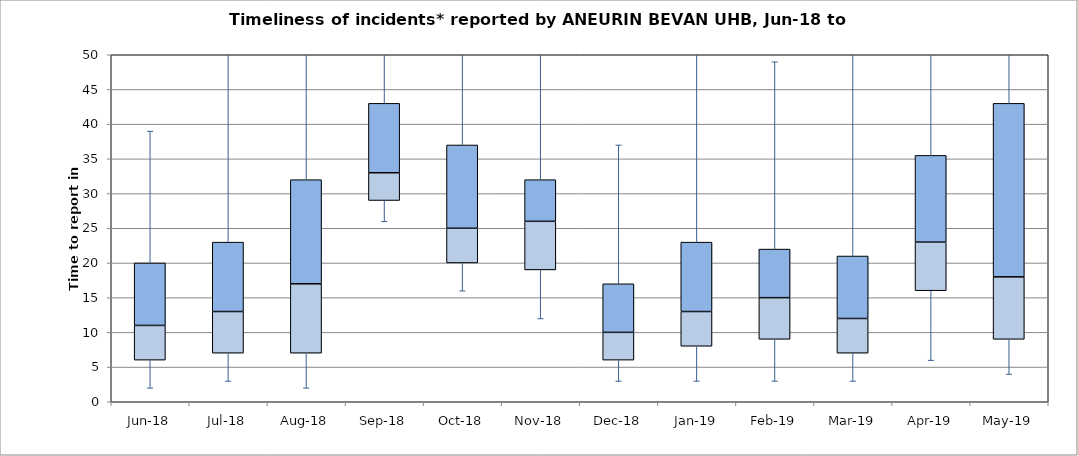
| Category | Series 0 | Series 1 | Series 2 |
|---|---|---|---|
| Jun-18 | 6 | 5 | 9 |
| Jul-18 | 7 | 6 | 10 |
| Aug-18 | 7 | 10 | 15 |
| Sep-18 | 29 | 4 | 10 |
| Oct-18 | 20 | 5 | 12 |
| Nov-18 | 19 | 7 | 6 |
| Dec-18 | 6 | 4 | 7 |
| Jan-19 | 8 | 5 | 10 |
| Feb-19 | 9 | 6 | 7 |
| Mar-19 | 7 | 5 | 9 |
| Apr-19 | 16 | 7 | 12.5 |
| May-19 | 9 | 9 | 25 |